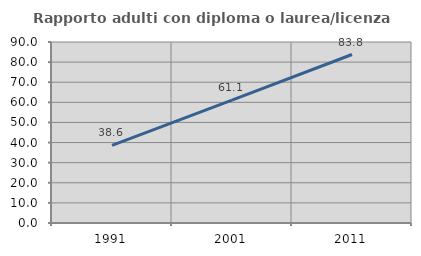
| Category | Rapporto adulti con diploma o laurea/licenza media  |
|---|---|
| 1991.0 | 38.62 |
| 2001.0 | 61.099 |
| 2011.0 | 83.774 |